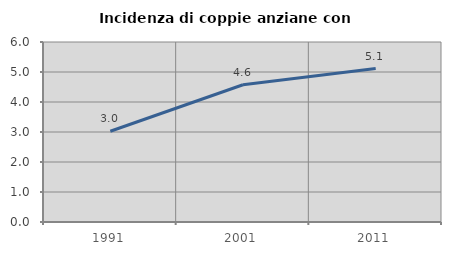
| Category | Incidenza di coppie anziane con figli |
|---|---|
| 1991.0 | 3.024 |
| 2001.0 | 4.574 |
| 2011.0 | 5.113 |